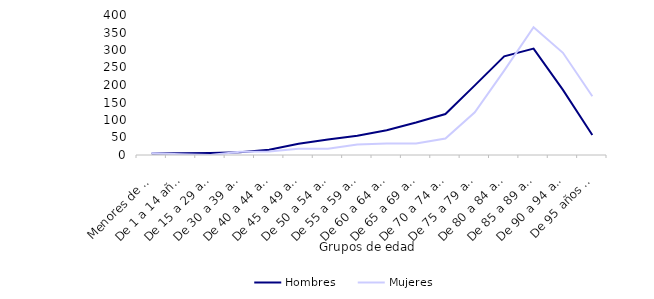
| Category | Hombres | Mujeres |
|---|---|---|
| Menores de 1 año | 4 | 5 |
| De 1 a 14 años | 5 | 2 |
| De 15 a 29 años | 6 | 0 |
| De 30 a 39 años | 8 | 9 |
| De 40 a 44 años | 15 | 10 |
| De 45 a 49 años | 32 | 18 |
| De 50 a 54 años | 44 | 18 |
| De 55 a 59 años | 55 | 30 |
| De 60 a 64 años | 71 | 33 |
| De 65 a 69 años | 93 | 33 |
| De 70 a 74 años | 117 | 47 |
| De 75 a 79 años | 199 | 122 |
| De 80 a 84 años | 282 | 241 |
| De 85 a 89 años | 304 | 365 |
| De 90 a 94 años | 186 | 292 |
| De 95 años y más | 57 | 168 |